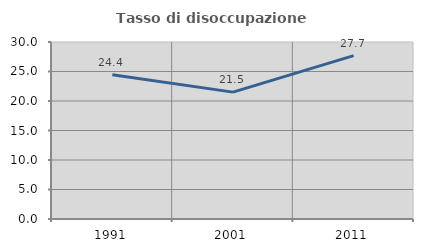
| Category | Tasso di disoccupazione giovanile  |
|---|---|
| 1991.0 | 24.444 |
| 2001.0 | 21.505 |
| 2011.0 | 27.692 |